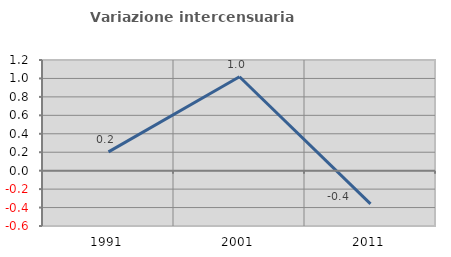
| Category | Variazione intercensuaria annua |
|---|---|
| 1991.0 | 0.204 |
| 2001.0 | 1.018 |
| 2011.0 | -0.361 |